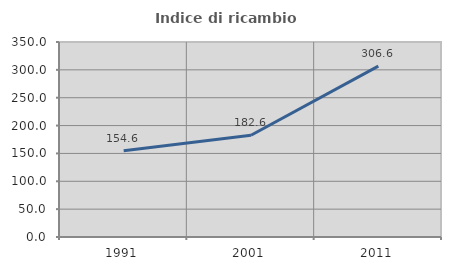
| Category | Indice di ricambio occupazionale  |
|---|---|
| 1991.0 | 154.639 |
| 2001.0 | 182.609 |
| 2011.0 | 306.579 |